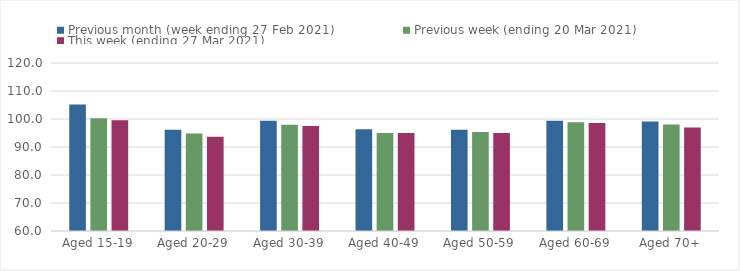
| Category | Previous month (week ending 27 Feb 2021) | Previous week (ending 20 Mar 2021) | This week (ending 27 Mar 2021) |
|---|---|---|---|
| Aged 15-19 | 105.19 | 100.3 | 99.58 |
| Aged 20-29 | 96.15 | 94.79 | 93.62 |
| Aged 30-39 | 99.41 | 97.93 | 97.48 |
| Aged 40-49 | 96.37 | 95.01 | 94.96 |
| Aged 50-59 | 96.19 | 95.4 | 94.97 |
| Aged 60-69 | 99.34 | 98.83 | 98.59 |
| Aged 70+ | 99.14 | 98.02 | 96.93 |